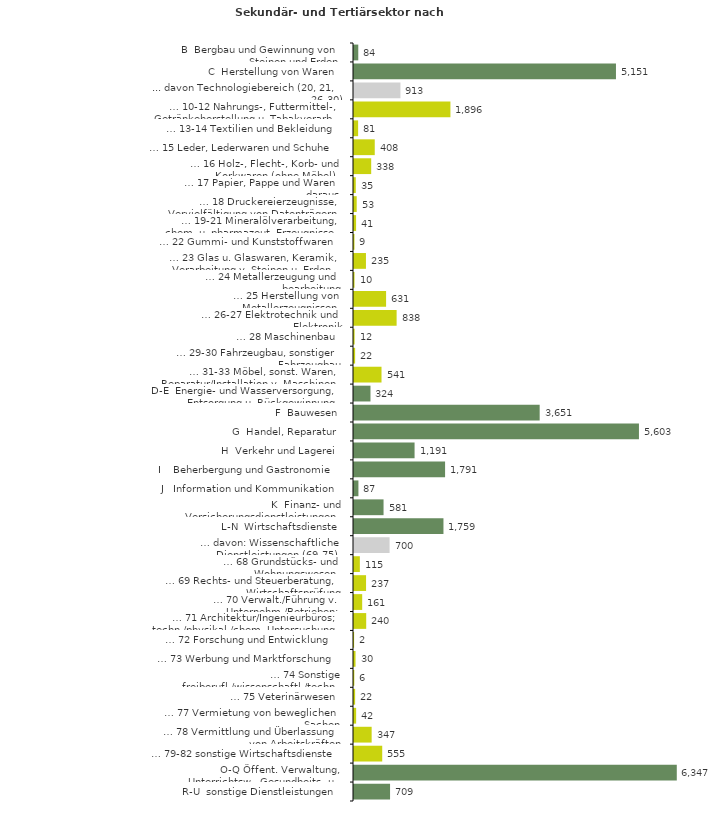
| Category | Series 0 |
|---|---|
| B  Bergbau und Gewinnung von Steinen und Erden | 84 |
| C  Herstellung von Waren | 5151 |
| ... davon Technologiebereich (20, 21, 26-30) | 913 |
| … 10-12 Nahrungs-, Futtermittel-, Getränkeherstellung u. Tabakverarb. | 1896 |
| … 13-14 Textilien und Bekleidung | 81 |
| … 15 Leder, Lederwaren und Schuhe | 408 |
| … 16 Holz-, Flecht-, Korb- und Korkwaren (ohne Möbel)  | 338 |
| … 17 Papier, Pappe und Waren daraus  | 35 |
| … 18 Druckereierzeugnisse, Vervielfältigung von Datenträgern | 53 |
| … 19-21 Mineralölverarbeitung, chem. u. pharmazeut. Erzeugnisse | 41 |
| … 22 Gummi- und Kunststoffwaren | 9 |
| … 23 Glas u. Glaswaren, Keramik, Verarbeitung v. Steinen u. Erden  | 235 |
| … 24 Metallerzeugung und -bearbeitung | 10 |
| … 25 Herstellung von Metallerzeugnissen  | 631 |
| … 26-27 Elektrotechnik und Elektronik | 838 |
| … 28 Maschinenbau | 12 |
| … 29-30 Fahrzeugbau, sonstiger Fahrzeugbau | 22 |
| … 31-33 Möbel, sonst. Waren, Reparatur/Installation v. Maschinen | 541 |
| D-E  Energie- und Wasserversorgung, Entsorgung u. Rückgewinnung | 324 |
| F  Bauwesen | 3651 |
| G  Handel, Reparatur | 5603 |
| H  Verkehr und Lagerei | 1191 |
| I    Beherbergung und Gastronomie | 1791 |
| J   Information und Kommunikation | 87 |
| K  Finanz- und Versicherungsdienstleistungen | 581 |
| L-N  Wirtschaftsdienste | 1759 |
| … davon: Wissenschaftliche Dienstleistungen (69-75) | 700 |
| … 68 Grundstücks- und Wohnungswesen  | 115 |
| … 69 Rechts- und Steuerberatung, Wirtschaftsprüfung | 237 |
| … 70 Verwalt./Führung v. Unternehm./Betrieben; Unternehmensberat. | 161 |
| … 71 Architektur/Ingenieurbüros; techn./physikal./chem. Untersuchung | 240 |
| … 72 Forschung und Entwicklung  | 2 |
| … 73 Werbung und Marktforschung | 30 |
| … 74 Sonstige freiberufl./wissenschaftl./techn. Tätigkeiten | 6 |
| … 75 Veterinärwesen | 22 |
| … 77 Vermietung von beweglichen Sachen  | 42 |
| … 78 Vermittlung und Überlassung von Arbeitskräften | 347 |
| … 79-82 sonstige Wirtschaftsdienste | 555 |
| O-Q Öffent. Verwaltung, Unterrichtsw., Gesundheits- u. Sozialwesen | 6347 |
| R-U  sonstige Dienstleistungen | 709 |